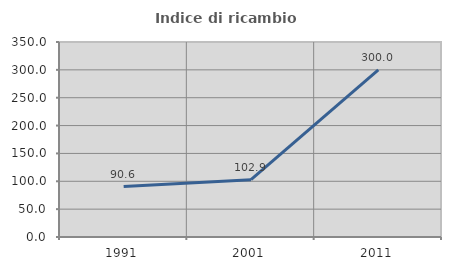
| Category | Indice di ricambio occupazionale  |
|---|---|
| 1991.0 | 90.554 |
| 2001.0 | 102.888 |
| 2011.0 | 300 |